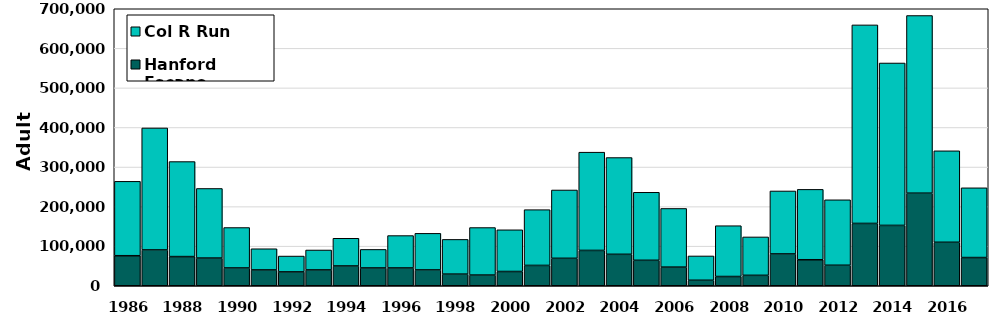
| Category | Hanford Escape | Col R Run |
|---|---|---|
| 1986.0 | 75928 | 187985.4 |
| 1987.0 | 90553 | 308246.599 |
| 1988.0 | 73717 | 240143.3 |
| 1989.0 | 70000 | 175854.742 |
| 1990.0 | 45000 | 102128.556 |
| 1991.0 | 40000 | 53532.721 |
| 1992.0 | 35000 | 40068.26 |
| 1993.0 | 40000 | 50353.629 |
| 1994.0 | 50000 | 70013.654 |
| 1995.0 | 45000 | 46829.791 |
| 1996.0 | 45000 | 81849.356 |
| 1997.0 | 40000 | 92469.807 |
| 1998.0 | 29410 | 87713.398 |
| 1999.0 | 27012 | 120083.238 |
| 2000.0 | 36027 | 105396.183 |
| 2001.0 | 51394 | 140925.244 |
| 2002.0 | 69342 | 172671.846 |
| 2003.0 | 89312 | 248285.667 |
| 2004.0 | 79464.3 | 244524.144 |
| 2005.0 | 64355 | 171849.794 |
| 2006.0 | 47095 | 148256.045 |
| 2007.0 | 13887 | 61419.732 |
| 2008.0 | 23361 | 128411.687 |
| 2009.0 | 26346 | 97028.697 |
| 2010.0 | 80408.35 | 159120.721 |
| 2011.0 | 65724 | 177855.001 |
| 2012.0 | 51813 | 165405.805 |
| 2013.0 | 157484.298 | 501697.178 |
| 2014.0 | 152517 | 410390.651 |
| 2015.0 | 233927.117 | 448992.626 |
| 2016.0 | 109860 | 231144.079 |
| 2017.0 | 71303 | 176230.598 |